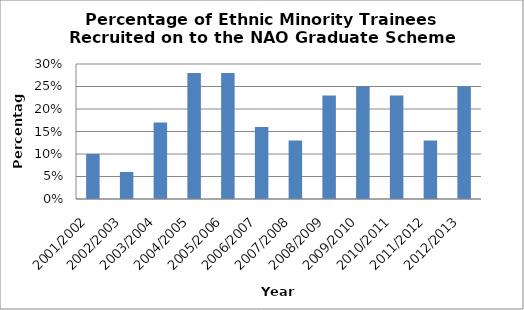
| Category | Percentage |
|---|---|
| 2001/2002 | 0.1 |
| 2002/2003 | 0.06 |
| 2003/2004 | 0.17 |
| 2004/2005 | 0.28 |
| 2005/2006 | 0.28 |
| 2006/2007 | 0.16 |
| 2007/2008 | 0.13 |
| 2008/2009 | 0.23 |
| 2009/2010 | 0.25 |
| 2010/2011 | 0.23 |
| 2011/2012 | 0.13 |
| 2012/2013 | 0.25 |